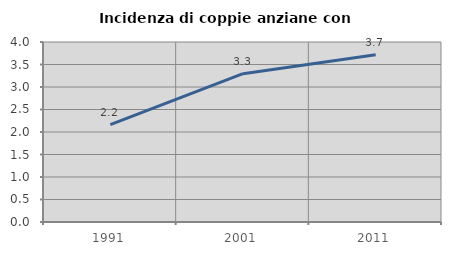
| Category | Incidenza di coppie anziane con figli |
|---|---|
| 1991.0 | 2.163 |
| 2001.0 | 3.297 |
| 2011.0 | 3.719 |